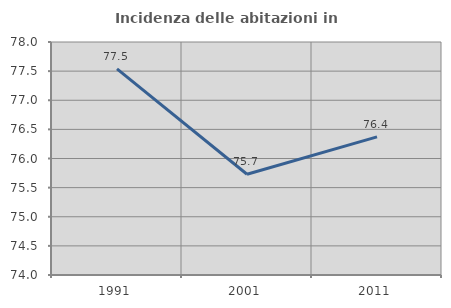
| Category | Incidenza delle abitazioni in proprietà  |
|---|---|
| 1991.0 | 77.539 |
| 2001.0 | 75.729 |
| 2011.0 | 76.37 |